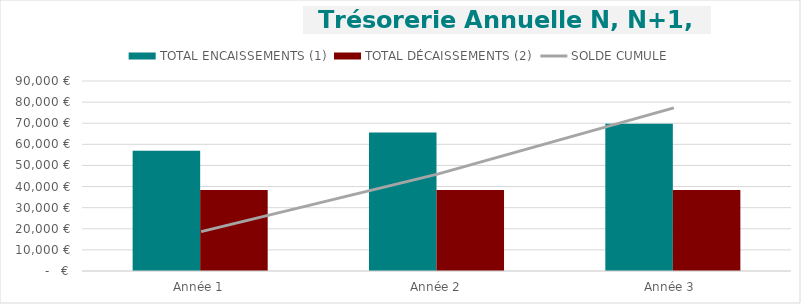
| Category | TOTAL ENCAISSEMENTS (1) | TOTAL DÉCAISSEMENTS (2) |
|---|---|---|
| Année 1 | 57000 | 38353.77 |
| Année 2 | 65600 | 38346.32 |
| Année 3  | 69700 | 38346.32 |